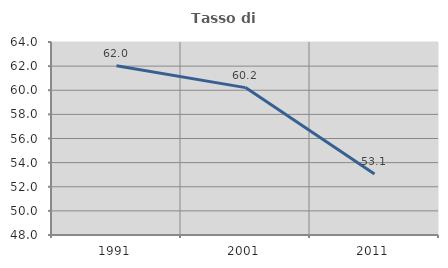
| Category | Tasso di occupazione   |
|---|---|
| 1991.0 | 62.032 |
| 2001.0 | 60.218 |
| 2011.0 | 53.05 |